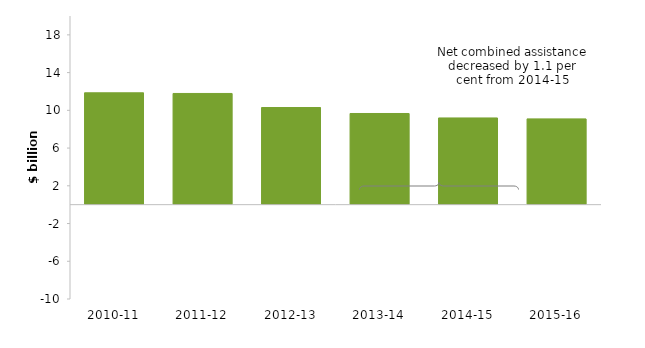
| Category | Net combined assistance |
|---|---|
| 2010-11 | 11.859 |
| 2011-12 | 11.788 |
| 2012-13 | 10.298 |
| 2013-14 | 9.666 |
| 2014-15 | 9.192 |
| 2015-16 | 9.093 |